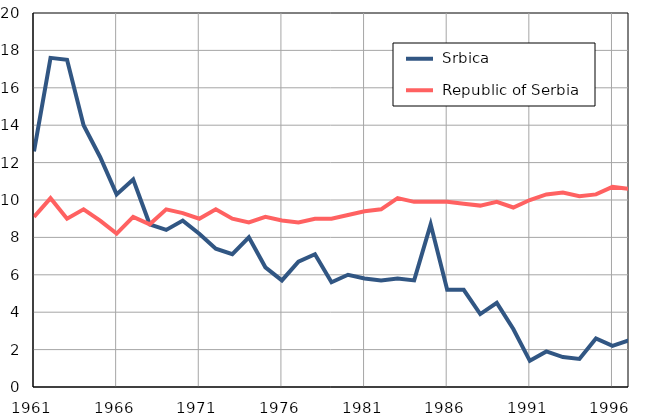
| Category |  Srbica |  Republic of Serbia |
|---|---|---|
| 1961.0 | 12.6 | 9.1 |
| 1962.0 | 17.6 | 10.1 |
| 1963.0 | 17.5 | 9 |
| 1964.0 | 14 | 9.5 |
| 1965.0 | 12.3 | 8.9 |
| 1966.0 | 10.3 | 8.2 |
| 1967.0 | 11.1 | 9.1 |
| 1968.0 | 8.7 | 8.7 |
| 1969.0 | 8.4 | 9.5 |
| 1970.0 | 8.9 | 9.3 |
| 1971.0 | 8.2 | 9 |
| 1972.0 | 7.4 | 9.5 |
| 1973.0 | 7.1 | 9 |
| 1974.0 | 8 | 8.8 |
| 1975.0 | 6.4 | 9.1 |
| 1976.0 | 5.7 | 8.9 |
| 1977.0 | 6.7 | 8.8 |
| 1978.0 | 7.1 | 9 |
| 1979.0 | 5.6 | 9 |
| 1980.0 | 6 | 9.2 |
| 1981.0 | 5.8 | 9.4 |
| 1982.0 | 5.7 | 9.5 |
| 1983.0 | 5.8 | 10.1 |
| 1984.0 | 5.7 | 9.9 |
| 1985.0 | 8.7 | 9.9 |
| 1986.0 | 5.2 | 9.9 |
| 1987.0 | 5.2 | 9.8 |
| 1988.0 | 3.9 | 9.7 |
| 1989.0 | 4.5 | 9.9 |
| 1990.0 | 3.1 | 9.6 |
| 1991.0 | 1.4 | 10 |
| 1992.0 | 1.9 | 10.3 |
| 1993.0 | 1.6 | 10.4 |
| 1994.0 | 1.5 | 10.2 |
| 1995.0 | 2.6 | 10.3 |
| 1996.0 | 2.2 | 10.7 |
| 1997.0 | 2.5 | 10.6 |